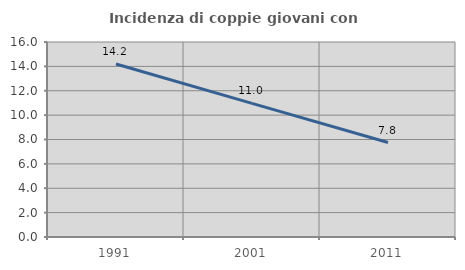
| Category | Incidenza di coppie giovani con figli |
|---|---|
| 1991.0 | 14.196 |
| 2001.0 | 10.966 |
| 2011.0 | 7.751 |